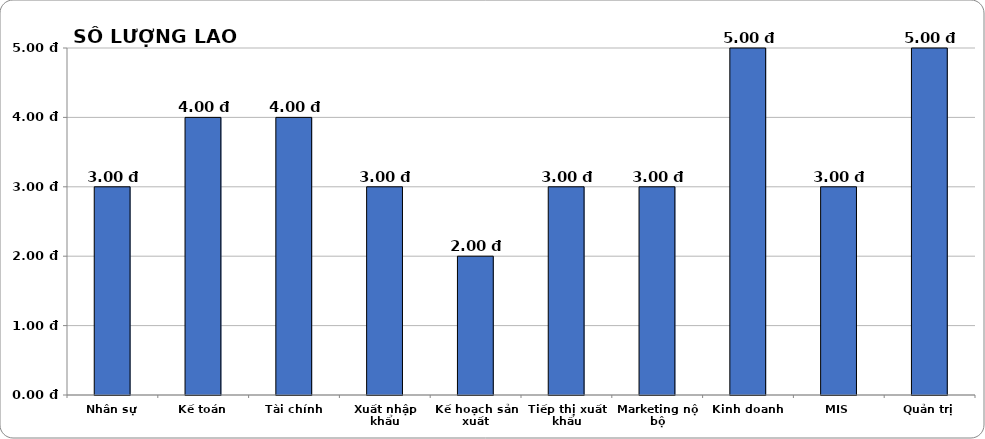
| Category | EMPLOYEES |
|---|---|
| Nhân sự | 3 |
| Kế toán | 4 |
| Tài chính | 4 |
| Xuất nhập khẩu | 3 |
| Kế hoạch sản xuất | 2 |
| Tiếp thị xuất khẩu | 3 |
| Marketing nộ bộ | 3 |
| Kinh doanh | 5 |
| MIS | 3 |
| Quản trị | 5 |